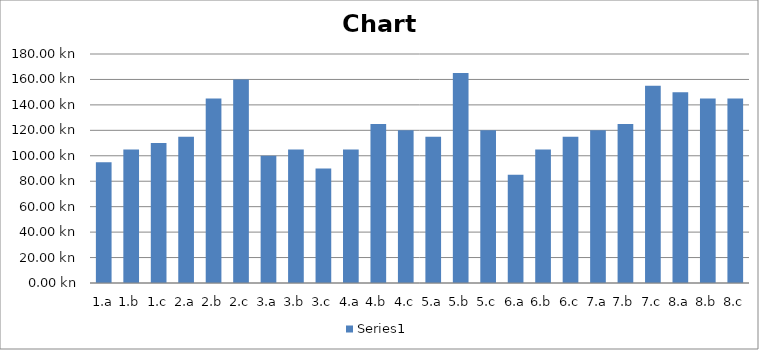
| Category | Series 0 |
|---|---|
| 1.a | 95 |
| 1.b  | 105 |
| 1.c  | 110 |
| 2.a | 115 |
| 2.b  | 145 |
| 2.c  | 160 |
| 3.a | 100 |
| 3.b  | 105 |
| 3.c  | 90 |
| 4.a | 105 |
| 4.b  | 125 |
| 4.c  | 120 |
| 5.a | 115 |
| 5.b  | 165 |
| 5.c  | 120 |
| 6.a | 85 |
| 6.b  | 105 |
| 6.c  | 115 |
| 7.a | 120 |
| 7.b  | 125 |
| 7.c  | 155 |
| 8.a | 150 |
| 8.b  | 145 |
| 8.c  | 145 |